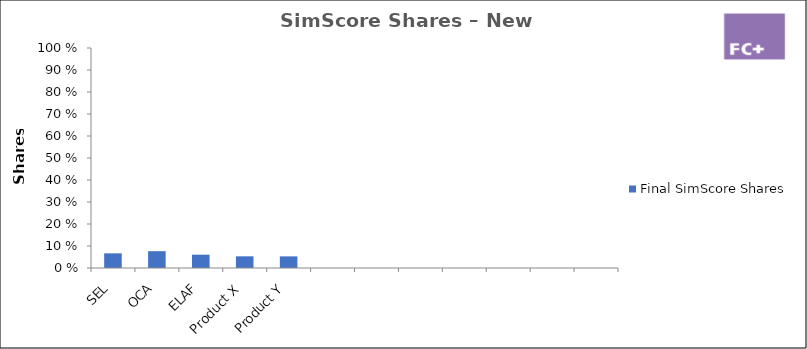
| Category | Final SimScore Shares |
|---|---|
| SEL | 0.067 |
| OCA | 0.076 |
| ELAF | 0.061 |
| Product X | 0.053 |
| Product Y | 0.053 |